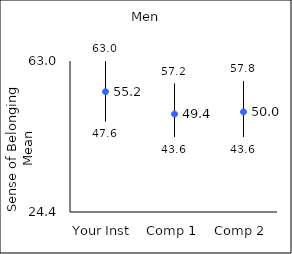
| Category | 25th percentile | 75th percentile | Mean |
|---|---|---|---|
| Your Inst | 47.6 | 63 | 55.16 |
| Comp 1 | 43.6 | 57.2 | 49.44 |
| Comp 2 | 43.6 | 57.8 | 49.99 |